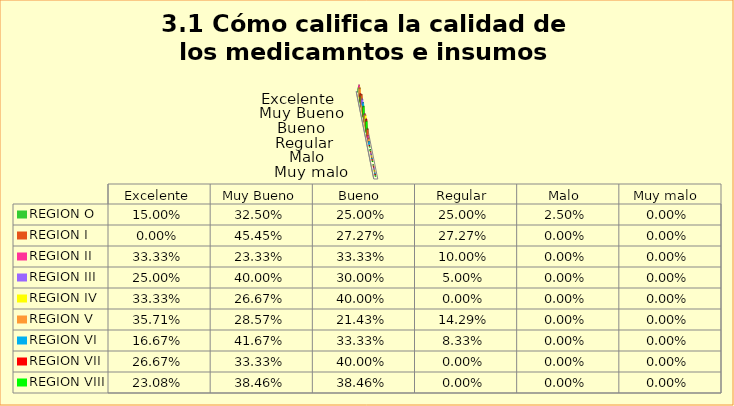
| Category | REGION O | REGION I  | REGION II | REGION III | REGION IV | REGION V  | REGION VI  | REGION VII  | REGION VIII |
|---|---|---|---|---|---|---|---|---|---|
| Excelente | 0.15 | 0 | 0.333 | 0.25 | 0.333 | 0.357 | 0.167 | 0.267 | 0.231 |
| Muy Bueno | 0.325 | 0.455 | 0.233 | 0.4 | 0.267 | 0.286 | 0.417 | 0.333 | 0.385 |
| Bueno  | 0.25 | 0.273 | 0.333 | 0.3 | 0.4 | 0.214 | 0.333 | 0.4 | 0.385 |
| Regular  | 0.25 | 0.273 | 0.1 | 0.05 | 0 | 0.143 | 0.083 | 0 | 0 |
| Malo  | 0.025 | 0 | 0 | 0 | 0 | 0 | 0 | 0 | 0 |
| Muy malo  | 0 | 0 | 0 | 0 | 0 | 0 | 0 | 0 | 0 |